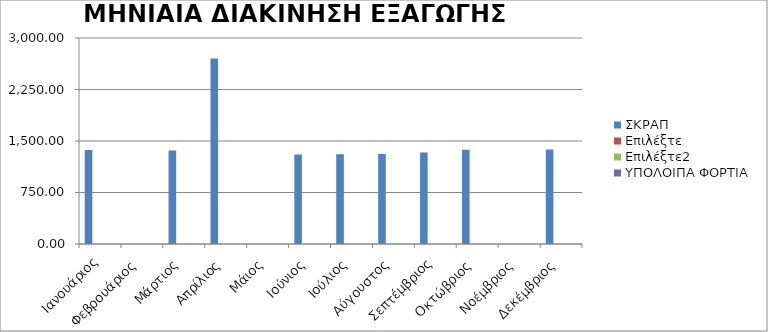
| Category | ΣΚΡΑΠ | Επιλέξτε | Επιλέξτε2 | ΥΠΟΛΟΙΠΑ ΦΟΡΤΙΑ |
|---|---|---|---|---|
| Ιανουάριος | 1368.07 | 0 | 0 | 0 |
| Φεβρουάριος | 0 | 0 | 0 | 0 |
| Μάρτιος | 1360.21 | 0 | 0 | 0 |
| Απρίλιος | 2702.75 | 0 | 0 | 0 |
| Μάιος | 0 | 0 | 0 | 0 |
| Ιούνιος | 1303.75 | 0 | 0 | 0 |
| Ιούλιος | 1308.01 | 0 | 0 | 0 |
| Αύγουστος | 1312.67 | 0 | 0 | 0 |
| Σεπτέμβριος | 1332.37 | 0 | 0 | 0 |
| Οκτώβριος | 1372.73 | 0 | 0 | 0 |
| Νοέμβριος | 0 | 0 | 0 | 0 |
| Δεκέμβριος | 1374.72 | 0 | 0 | 0 |